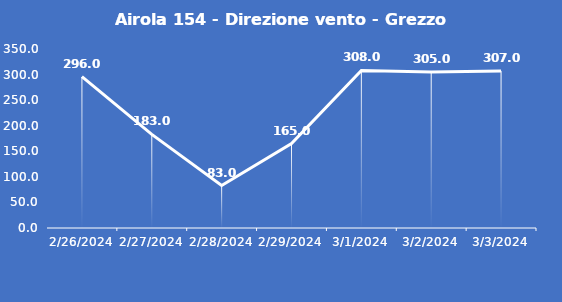
| Category | Airola 154 - Direzione vento - Grezzo (°N) |
|---|---|
| 2/26/24 | 296 |
| 2/27/24 | 183 |
| 2/28/24 | 83 |
| 2/29/24 | 165 |
| 3/1/24 | 308 |
| 3/2/24 | 305 |
| 3/3/24 | 307 |